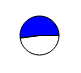
| Category | Series 0 |
|---|---|
| 0 | 8362318 |
| 1 | 9080768 |